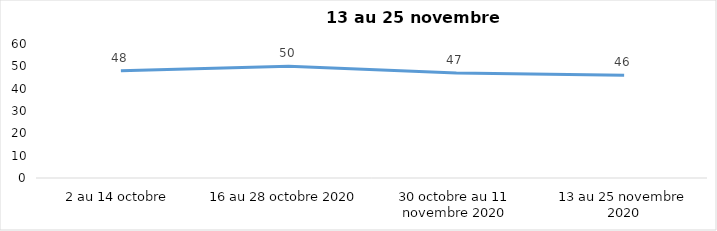
| Category | Series 0 |
|---|---|
| 2 au 14 octobre | 48 |
| 16 au 28 octobre 2020 | 50 |
| 30 octobre au 11 novembre 2020 | 47 |
| 13 au 25 novembre 2020 | 46 |